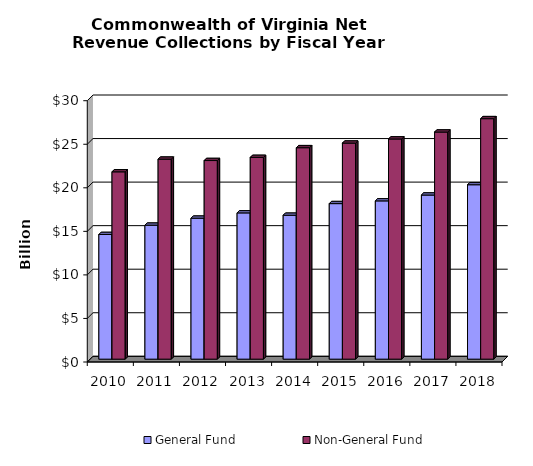
| Category | General Fund | Non-General Fund  |
|---|---|---|
| 2010.0 | 14.31 | 21.508 |
| 2011.0 | 15.379 | 22.96 |
| 2012.0 | 16.182 | 22.803 |
| 2013.0 | 16.792 | 23.162 |
| 2014.0 | 16.52 | 24.275 |
| 2015.0 | 17.857 | 24.805 |
| 2016.0 | 18.17 | 25.28 |
| 2017.0 | 18.84 | 26.074 |
| 2018.0 | 20.024 | 27.609 |